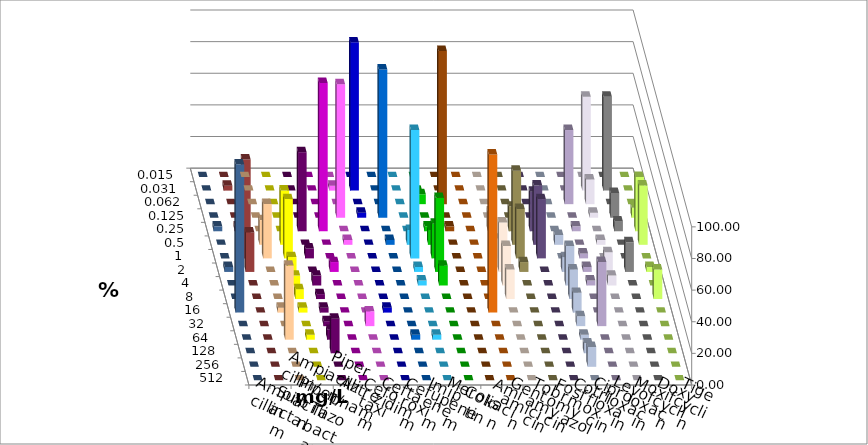
| Category | Ampicillin | Ampicillin/ Sulbactam | Piperacillin | Piperacillin/ Tazobactam | Aztreonam | Cefotaxim | Ceftazidim | Cefuroxim | Imipenem | Meropenem | Colistin | Amikacin | Gentamicin | Tobramycin | Fosfomycin | Cotrimoxazol | Ciprofloxacin | Levofloxacin | Moxifloxacin | Doxycyclin | Tigecyclin |
|---|---|---|---|---|---|---|---|---|---|---|---|---|---|---|---|---|---|---|---|---|---|
| 0.015 | 0 | 0 | 0 | 0 | 0 | 0 | 0 | 0 | 0 | 0 | 0 | 0 | 0 | 0 | 0 | 0 | 0 | 0 | 0 | 0 | 0 |
| 0.031 | 0 | 0 | 0 | 0 | 3.125 | 93.75 | 0 | 0 | 0 | 0 | 0 | 0 | 0 | 0 | 0 | 0 | 59.375 | 59.375 | 0 | 0 | 3.125 |
| 0.062 | 0 | 0 | 0 | 0 | 0 | 0 | 0 | 0 | 6.25 | 96.875 | 0 | 0 | 0 | 0 | 0 | 46.875 | 15.625 | 0 | 0 | 0 | 0 |
| 0.125 | 0 | 0 | 0 | 0 | 84.375 | 3.125 | 93.75 | 0 | 0 | 0 | 0 | 0 | 0 | 0 | 0 | 0 | 3.125 | 15.625 | 6.25 | 0 | 0 |
| 0.25 | 0 | 0 | 50 | 93.75 | 0 | 0 | 0 | 0 | 3.125 | 3.125 | 0 | 12.5 | 15.625 | 25 | 0 | 3.125 | 0 | 6.25 | 34.375 | 3.125 | 3.125 |
| 0.5 | 15.625 | 34.375 | 0 | 0 | 3.125 | 0 | 3.125 | 9.375 | 9.375 | 0 | 0 | 0 | 46.875 | 37.5 | 6.25 | 0 | 3.125 | 0 | 37.5 | 0 | 6.25 |
| 1.0 | 34.375 | 37.5 | 6.25 | 0 | 0 | 0 | 0 | 81.25 | 21.875 | 0 | 0 | 12.5 | 31.25 | 37.5 | 0 | 3.125 | 0 | 0 | 0 | 0 | 62.5 |
| 2.0 | 0 | 9.375 | 0 | 6.25 | 0 | 0 | 0 | 3.125 | 46.875 | 0 | 0 | 31.25 | 6.25 | 0 | 9.375 | 3.125 | 12.5 | 18.75 | 3.125 | 3.125 | 25 |
| 4.0 | 0 | 6.25 | 6.25 | 0 | 0 | 0 | 0 | 3.125 | 12.5 | 0 | 0 | 25 | 0 | 0 | 25 | 3.125 | 6.25 | 0 | 0 | 0 | 0 |
| 8.0 | 0 | 6.25 | 3.125 | 0 | 0 | 0 | 0 | 0 | 0 | 0 | 0 | 18.75 | 0 | 0 | 18.75 | 0 | 0 | 0 | 18.75 | 0 | 0 |
| 16.0 | 3.125 | 3.125 | 3.125 | 0 | 0 | 3.125 | 0 | 0 | 0 | 0 | 100 | 0 | 0 | 0 | 12.5 | 0 | 0 | 0 | 0 | 93.75 | 0 |
| 32.0 | 0 | 0 | 3.125 | 0 | 9.375 | 0 | 0 | 0 | 0 | 0 | 0 | 0 | 0 | 0 | 6.25 | 40.625 | 0 | 0 | 0 | 0 | 0 |
| 64.0 | 46.875 | 3.125 | 6.25 | 0 | 0 | 0 | 3.125 | 3.125 | 0 | 0 | 0 | 0 | 0 | 0 | 3.125 | 0 | 0 | 0 | 0 | 0 | 0 |
| 128.0 | 0 | 0 | 21.875 | 0 | 0 | 0 | 0 | 0 | 0 | 0 | 0 | 0 | 0 | 0 | 6.25 | 0 | 0 | 0 | 0 | 0 | 0 |
| 256.0 | 0 | 0 | 0 | 0 | 0 | 0 | 0 | 0 | 0 | 0 | 0 | 0 | 0 | 0 | 12.5 | 0 | 0 | 0 | 0 | 0 | 0 |
| 512.0 | 0 | 0 | 0 | 0 | 0 | 0 | 0 | 0 | 0 | 0 | 0 | 0 | 0 | 0 | 0 | 0 | 0 | 0 | 0 | 0 | 0 |